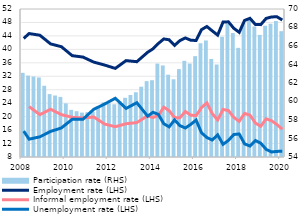
| Category | Participation rate (RHS) |
|---|---|
| 2008 | 63.1 |
| II | 62.8 |
| III | 62.7 |
| IV | 62.6 |
| 2009 | 61.7 |
| II | 60.8 |
| III | 60.65 |
| IV | 60.5 |
| 2010 | 59.8 |
| II | 59.1 |
| III | 58.95 |
| IV | 58.8 |
| 2011 | 58.85 |
| II | 58.9 |
| III | 59.4 |
| IV | 59.9 |
| 2012 | 59.8 |
| II | 59.7 |
| III | 60.05 |
| IV | 60.4 |
| 2013 | 60.7 |
| II | 61 |
| III | 61.6 |
| IV | 62.2 |
| 2014 | 62.3 |
| II | 64.1 |
| III | 63.9 |
| IV | 62.9 |
| 2015 | 62.4 |
| II | 63.5 |
| III | 64.4 |
| IV | 64.1 |
| 2016 | 64.9 |
| II | 66.3 |
| III | 66.6 |
| IV | 64.6 |
| 2017 | 64 |
| II | 67 |
| III | 68.4 |
| IV | 67.4 |
| 2018 | 65.8 |
| II | 68.5 |
| III | 69 |
| IV | 68.1 |
| 2019 | 67.2 |
| II | 68.2 |
| III | 68.4 |
| IV | 68.7 |
| 2020 | 67.6 |